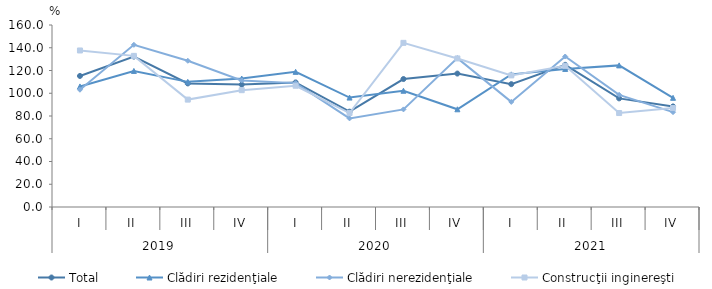
| Category | Total | Clădiri rezidenţiale | Clădiri nerezidenţiale | Construcţii inginereşti |
|---|---|---|---|---|
| 0 | 115.2 | 106 | 103.1 | 137.6 |
| 1 | 132.227 | 119.617 | 142.576 | 132.858 |
| 2 | 108.638 | 110.013 | 128.557 | 94.413 |
| 3 | 107.607 | 112.965 | 111.31 | 102.699 |
| 4 | 109.5 | 118.8 | 108.9 | 106.6 |
| 5 | 83.8 | 96.2 | 77.9 | 82.6 |
| 6 | 112.5 | 102.2 | 85.8 | 144.3 |
| 7 | 117.3 | 85.9 | 130.9 | 130.6 |
| 8 | 108 | 116.6 | 92.4 | 115.7 |
| 9 | 125 | 121.4 | 132.3 | 124.1 |
| 10 | 95.5 | 124.5 | 98.6 | 82.6 |
| 11 | 88.4 | 96 | 83.4 | 87 |